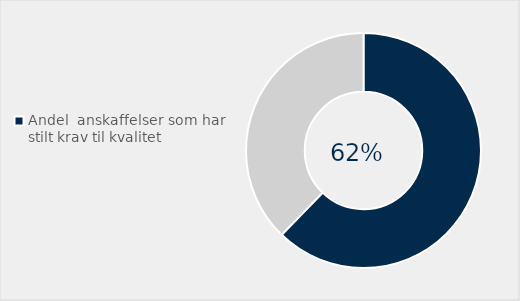
| Category | Series 0 |
|---|---|
| Andel  anskaffelser som har stilt krav til kvalitet | 0.623 |
| Ikke stilt krav til kvalitet | 0.377 |